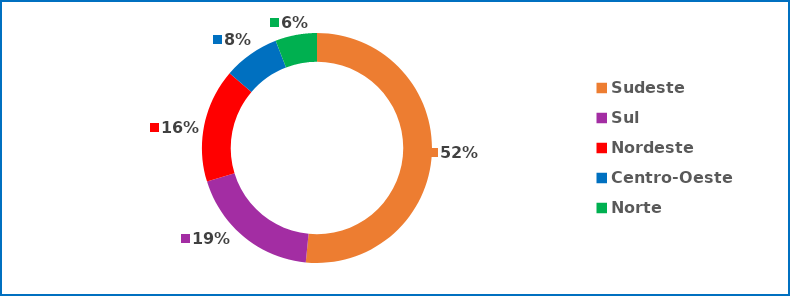
| Category | Total de Comunicações |
|---|---|
| Sudeste | 26972910 |
| Sul | 9793862 |
| Nordeste | 8360770 |
| Centro-Oeste | 4127835 |
| Norte | 3060222 |